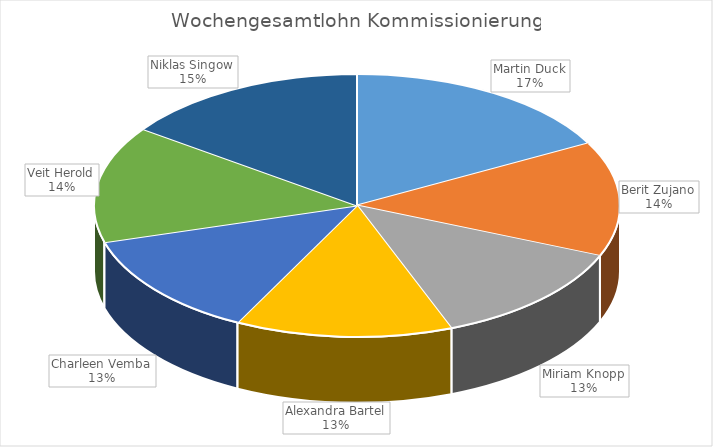
| Category | Series 0 |
|---|---|
| Martin Duck | 676.4 |
| Berit Zujano | 557.4 |
| Miriam Knopp | 509 |
| Alexandra Bartel | 526.4 |
| Charleen Vemba | 512.6 |
| Veit Herold | 567.4 |
| Niklas Singow | 597.2 |